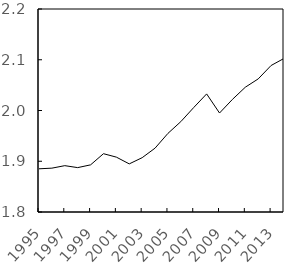
| Category | Series 0 |
|---|---|
| 1995.0 | 1.885 |
| 1996.0 | 1.886 |
| 1997.0 | 1.891 |
| 1998.0 | 1.887 |
| 1999.0 | 1.893 |
| 2000.0 | 1.915 |
| 2001.0 | 1.908 |
| 2002.0 | 1.895 |
| 2003.0 | 1.907 |
| 2004.0 | 1.926 |
| 2005.0 | 1.955 |
| 2006.0 | 1.978 |
| 2007.0 | 2.006 |
| 2008.0 | 2.033 |
| 2009.0 | 1.995 |
| 2010.0 | 2.022 |
| 2011.0 | 2.046 |
| 2012.0 | 2.062 |
| 2013.0 | 2.089 |
| 2014.0 | 2.103 |